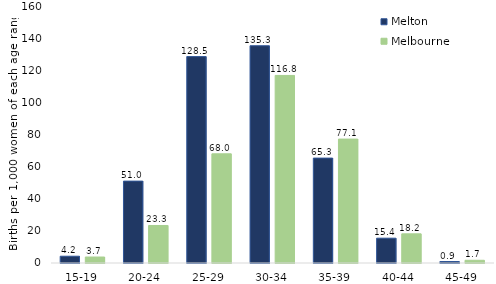
| Category | Melton  | Melbourne  |
|---|---|---|
| 15-19 | 4.218 | 3.717 |
| 20-24 | 50.977 | 23.348 |
| 25-29 | 128.492 | 67.975 |
| 30-34 | 135.253 | 116.765 |
| 35-39 | 65.309 | 77.145 |
| 40-44 | 15.438 | 18.164 |
| 45-49 | 0.926 | 1.685 |